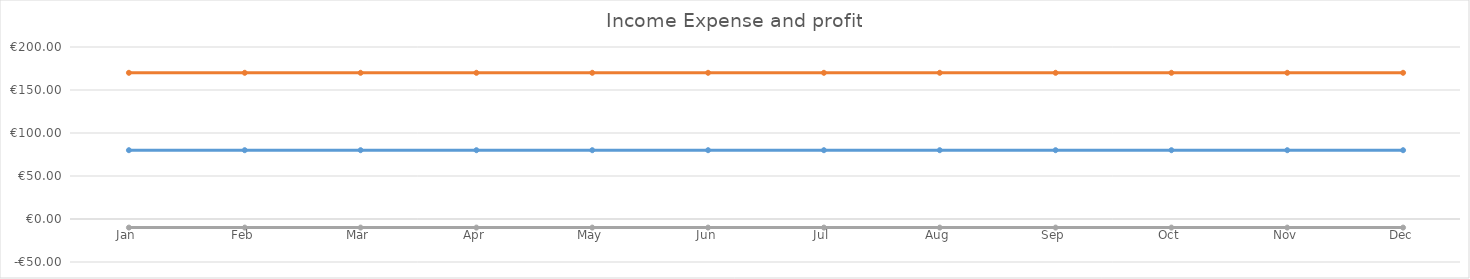
| Category | Income | Expense | Profit |
|---|---|---|---|
| Jan | 80 | 90 | -10 |
| Feb | 80 | 90 | -10 |
| Mar | 80 | 90 | -10 |
| Apr | 80 | 90 | -10 |
| May | 80 | 90 | -10 |
| Jun | 80 | 90 | -10 |
| Jul | 80 | 90 | -10 |
| Aug | 80 | 90 | -10 |
| Sep | 80 | 90 | -10 |
| Oct | 80 | 90 | -10 |
| Nov | 80 | 90 | -10 |
| Dec | 80 | 90 | -10 |